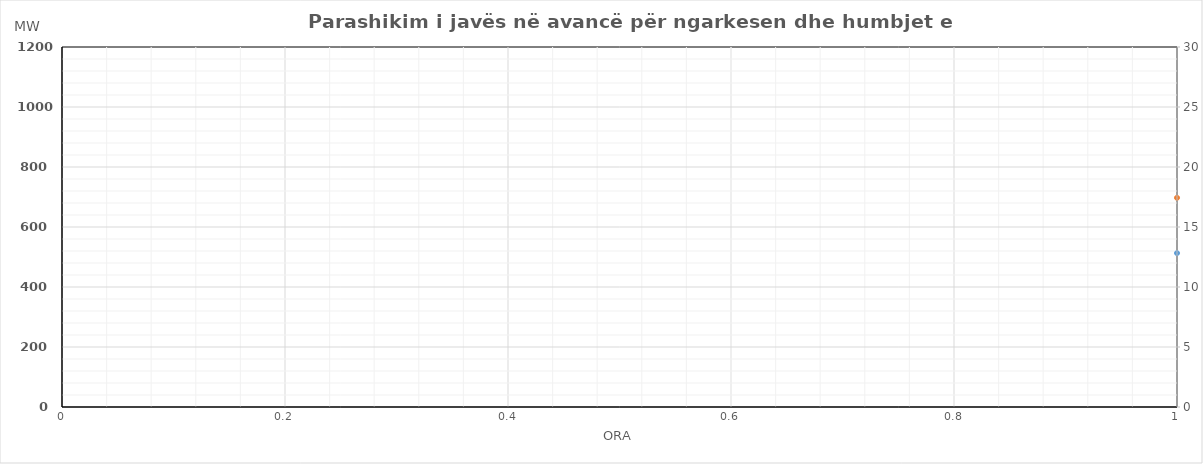
| Category | Ngarkesa (MWh) |
|---|---|
| 0 | 697.319 |
| 1 | 637.036 |
| 2 | 593.046 |
| 3 | 573.716 |
| 4 | 573.12 |
| 5 | 602.876 |
| 6 | 683.859 |
| 7 | 801.588 |
| 8 | 921.967 |
| 9 | 970.146 |
| 10 | 998.241 |
| 11 | 1052.468 |
| 12 | 1077.182 |
| 13 | 1077.155 |
| 14 | 1058.572 |
| 15 | 1027.125 |
| 16 | 1024.867 |
| 17 | 1043.563 |
| 18 | 1062.459 |
| 19 | 1063.575 |
| 20 | 1095.487 |
| 21 | 1035.673 |
| 22 | 925.778 |
| 23 | 805.227 |
| 24 | 730.961 |
| 25 | 667.028 |
| 26 | 632.793 |
| 27 | 612.78 |
| 28 | 608.574 |
| 29 | 634.563 |
| 30 | 716.842 |
| 31 | 853.19 |
| 32 | 963.898 |
| 33 | 1015.831 |
| 34 | 1047.298 |
| 35 | 1071.853 |
| 36 | 1100.344 |
| 37 | 1109.52 |
| 38 | 1066.671 |
| 39 | 1029.205 |
| 40 | 1017.12 |
| 41 | 1026.837 |
| 42 | 1049.221 |
| 43 | 1064.207 |
| 44 | 1100.615 |
| 45 | 1034.85 |
| 46 | 935.015 |
| 47 | 817.151 |
| 48 | 715.999 |
| 49 | 652.629 |
| 50 | 617.59 |
| 51 | 596.583 |
| 52 | 593.824 |
| 53 | 619.793 |
| 54 | 701.788 |
| 55 | 845.296 |
| 56 | 953.346 |
| 57 | 1001.578 |
| 58 | 1033.955 |
| 59 | 1059.419 |
| 60 | 1074.314 |
| 61 | 1084.144 |
| 62 | 1063.931 |
| 63 | 1039.707 |
| 64 | 1026.676 |
| 65 | 1027.263 |
| 66 | 1047.44 |
| 67 | 1056.841 |
| 68 | 1093.417 |
| 69 | 1025.173 |
| 70 | 923.307 |
| 71 | 807.791 |
| 72 | 717.646 |
| 73 | 654.886 |
| 74 | 622.719 |
| 75 | 603.539 |
| 76 | 600.299 |
| 77 | 623.381 |
| 78 | 705.697 |
| 79 | 850.501 |
| 80 | 964.693 |
| 81 | 1019.628 |
| 82 | 1046.291 |
| 83 | 1079.116 |
| 84 | 1091.487 |
| 85 | 1084.1 |
| 86 | 1042.835 |
| 87 | 1011.107 |
| 88 | 994.244 |
| 89 | 1000.633 |
| 90 | 1017.854 |
| 91 | 1039.402 |
| 92 | 1073.892 |
| 93 | 1011.002 |
| 94 | 905.44 |
| 95 | 792.305 |
| 96 | 709.041 |
| 97 | 644.794 |
| 98 | 612.226 |
| 99 | 593.496 |
| 100 | 593.669 |
| 101 | 619.844 |
| 102 | 710.621 |
| 103 | 850.724 |
| 104 | 958.809 |
| 105 | 1009.605 |
| 106 | 1045.456 |
| 107 | 1070.707 |
| 108 | 1085.347 |
| 109 | 1095.107 |
| 110 | 1074.507 |
| 111 | 1051.928 |
| 112 | 1039.625 |
| 113 | 1043.519 |
| 114 | 1060.668 |
| 115 | 1070.177 |
| 116 | 1105.072 |
| 117 | 1045.195 |
| 118 | 938.494 |
| 119 | 819.341 |
| 120 | 730.379 |
| 121 | 671.33 |
| 122 | 639.854 |
| 123 | 621.222 |
| 124 | 618.882 |
| 125 | 644.639 |
| 126 | 731.734 |
| 127 | 844.84 |
| 128 | 936.648 |
| 129 | 987.813 |
| 130 | 1019.37 |
| 131 | 1047.684 |
| 132 | 1068.461 |
| 133 | 1060.8 |
| 134 | 1052.982 |
| 135 | 1029.117 |
| 136 | 1029.613 |
| 137 | 1044.165 |
| 138 | 1068.205 |
| 139 | 1077.104 |
| 140 | 1121.011 |
| 141 | 1067.818 |
| 142 | 969.075 |
| 143 | 850.978 |
| 144 | 725.372 |
| 145 | 662.283 |
| 146 | 629.435 |
| 147 | 609.805 |
| 148 | 607.116 |
| 149 | 630.318 |
| 150 | 719.799 |
| 151 | 847.123 |
| 152 | 954.804 |
| 153 | 1012.17 |
| 154 | 1041.689 |
| 155 | 1069.722 |
| 156 | 1090.591 |
| 157 | 1089.876 |
| 158 | 1077.208 |
| 159 | 1053.945 |
| 160 | 1049.859 |
| 161 | 1052.924 |
| 162 | 1070.909 |
| 163 | 1079.947 |
| 164 | 1121.761 |
| 165 | 1066.246 |
| 166 | 964.873 |
| 167 | 843.675 |